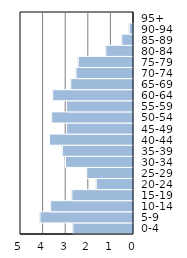
| Category | Series 0 |
|---|---|
| 0-4 | 2.68 |
| 5-9 | 4.137 |
| 10-14 | 3.667 |
| 15-19 | 2.727 |
| 20-24 | 1.646 |
| 25-29 | 2.069 |
| 30-34 | 3.009 |
| 35-39 | 3.15 |
| 40-44 | 3.714 |
| 45-49 | 2.962 |
| 50-54 | 3.62 |
| 55-59 | 2.962 |
| 60-64 | 3.573 |
| 65-69 | 2.774 |
| 70-74 | 2.539 |
| 75-79 | 2.445 |
| 80-84 | 1.222 |
| 85-89 | 0.517 |
| 90-94 | 0.188 |
| 95+ | 0 |